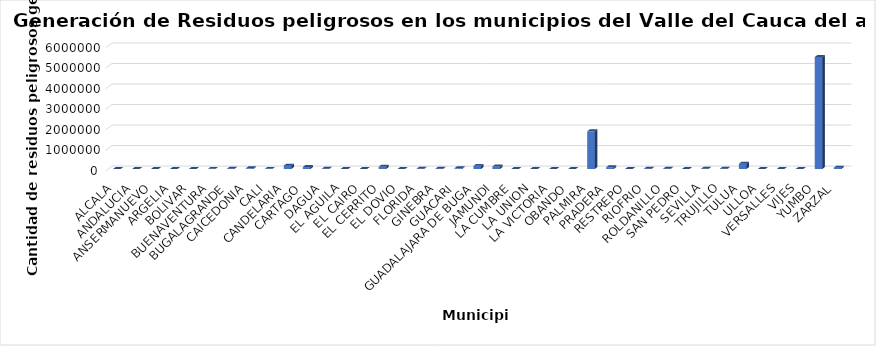
| Category | Total (kg) |
|---|---|
| ALCALA | 2306.12 |
| ANDALUCIA | 189 |
| ANSERMANUEVO | 2332.63 |
| ARGELIA | 1224 |
| BOLIVAR | 4231.5 |
| BUENAVENTURA | 5342.2 |
| BUGALAGRANDE | 10675.64 |
| CAICEDONIA | 34537.2 |
| CALI | 6667.5 |
| CANDELARIA | 163510.56 |
| CARTAGO | 92914.63 |
| DAGUA | 10117.13 |
| EL AGUILA | 1754 |
| EL CAIRO | 1343 |
| EL CERRITO | 106702.2 |
| EL DOVIO | 1889 |
| FLORIDA | 12261 |
| GINEBRA | 14696 |
| GUACARI | 35210.1 |
| GUADALAJARA DE BUGA | 151432.13 |
| JAMUNDI | 120493.58 |
| LA CUMBRE | 1373 |
| LA UNION | 4577.97 |
| LA VICTORIA | 3547 |
| OBANDO | 919.83 |
| PALMIRA | 1835558.44 |
| PRADERA | 82931.62 |
| RESTREPO | 3036 |
| RIOFRIO | 15127 |
| ROLDANILLO | 10364.5 |
| SAN PEDRO | 60 |
| SEVILLA | 9959 |
| TRUJILLO | 13768.17 |
| TULUA | 255252.8 |
| ULLOA | 567.55 |
| VERSALLES | 1696.5 |
| VIJES | 3020 |
| YUMBO | 5455698.08 |
| ZARZAL | 61497 |